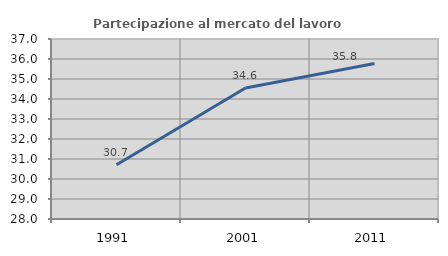
| Category | Partecipazione al mercato del lavoro  femminile |
|---|---|
| 1991.0 | 30.713 |
| 2001.0 | 34.554 |
| 2011.0 | 35.774 |